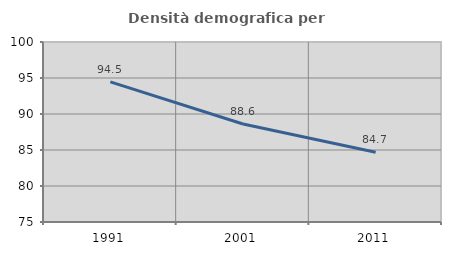
| Category | Densità demografica |
|---|---|
| 1991.0 | 94.452 |
| 2001.0 | 88.604 |
| 2011.0 | 84.69 |